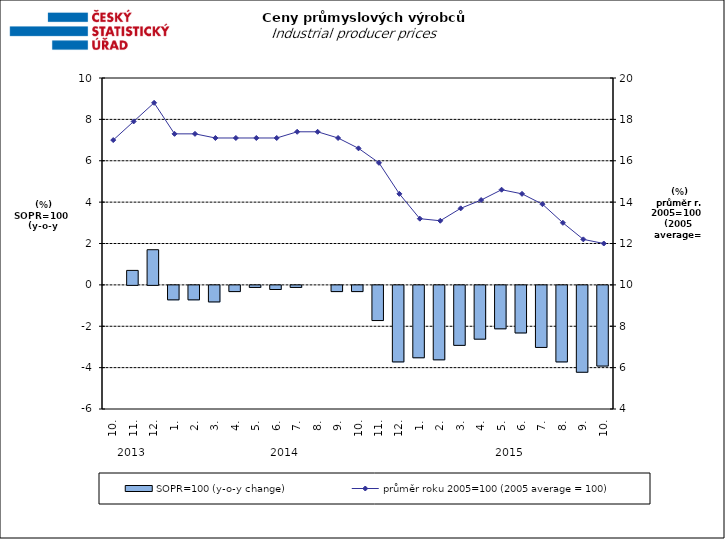
| Category | SOPR=100 (y-o-y change)   |
|---|---|
| 0 | 0 |
| 1 | 0.7 |
| 2 | 1.7 |
| 3 | -0.7 |
| 4 | -0.7 |
| 5 | -0.8 |
| 6 | -0.3 |
| 7 | -0.1 |
| 8 | -0.2 |
| 9 | -0.1 |
| 10 | 0 |
| 11 | -0.3 |
| 12 | -0.3 |
| 13 | -1.7 |
| 14 | -3.7 |
| 15 | -3.5 |
| 16 | -3.6 |
| 17 | -2.9 |
| 18 | -2.6 |
| 19 | -2.1 |
| 20 | -2.3 |
| 21 | -3 |
| 22 | -3.7 |
| 23 | -4.2 |
| 24 | -3.9 |